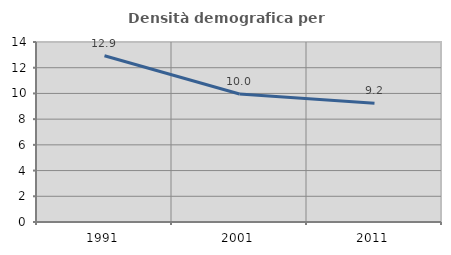
| Category | Densità demografica |
|---|---|
| 1991.0 | 12.934 |
| 2001.0 | 9.96 |
| 2011.0 | 9.228 |